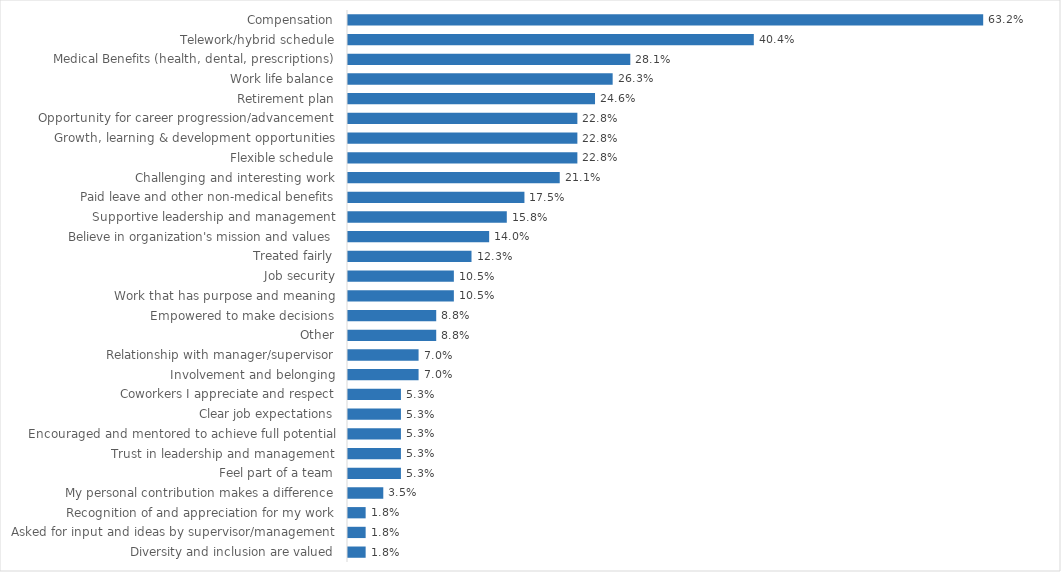
| Category | Agency of Human Services - CO |
|---|---|
| Compensation | 0.632 |
| Telework/hybrid schedule | 0.404 |
| Medical Benefits (health, dental, prescriptions) | 0.281 |
| Work life balance | 0.263 |
| Retirement plan | 0.246 |
| Opportunity for career progression/advancement | 0.228 |
| Growth, learning & development opportunities | 0.228 |
| Flexible schedule | 0.228 |
| Challenging and interesting work | 0.211 |
| Paid leave and other non-medical benefits | 0.175 |
| Supportive leadership and management | 0.158 |
| Believe in organization's mission and values | 0.14 |
| Treated fairly | 0.123 |
| Job security | 0.105 |
| Work that has purpose and meaning | 0.105 |
| Empowered to make decisions | 0.088 |
| Other | 0.088 |
| Relationship with manager/supervisor | 0.07 |
| Involvement and belonging | 0.07 |
| Coworkers I appreciate and respect | 0.053 |
| Clear job expectations | 0.053 |
| Encouraged and mentored to achieve full potential | 0.053 |
| Trust in leadership and management | 0.053 |
| Feel part of a team | 0.053 |
| My personal contribution makes a difference | 0.035 |
| Recognition of and appreciation for my work | 0.018 |
| Asked for input and ideas by supervisor/management | 0.018 |
| Diversity and inclusion are valued | 0.018 |